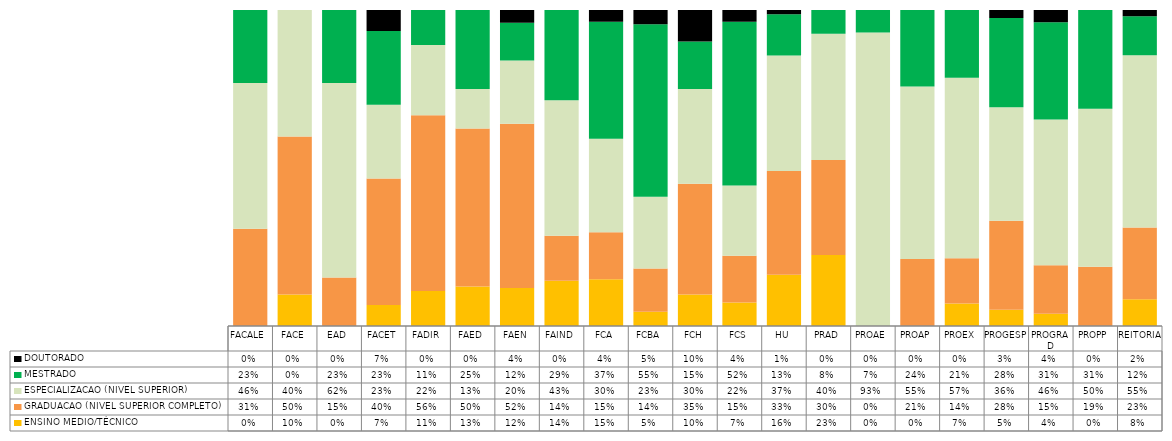
| Category | ENSINO MEDIO/TÉCNICO | GRADUACAO (NIVEL SUPERIOR COMPLETO) | ESPECIALIZACAO (NIVEL SUPERIOR)   | MESTRADO | DOUTORADO                             |
|---|---|---|---|---|---|
| FACALE | 0 | 0.308 | 0.462 | 0.231 | 0 |
| FACE | 0.1 | 0.5 | 0.4 | 0 | 0 |
| EAD | 0 | 0.154 | 0.615 | 0.231 | 0 |
| FACET | 0.067 | 0.4 | 0.233 | 0.233 | 0.067 |
| FADIR | 0.111 | 0.556 | 0.222 | 0.111 | 0 |
| FAED | 0.125 | 0.5 | 0.125 | 0.25 | 0 |
| FAEN | 0.12 | 0.52 | 0.2 | 0.12 | 0.04 |
| FAIND | 0.143 | 0.143 | 0.429 | 0.286 | 0 |
| FCA | 0.148 | 0.148 | 0.296 | 0.37 | 0.037 |
| FCBA | 0.045 | 0.136 | 0.227 | 0.545 | 0.045 |
| FCH | 0.1 | 0.35 | 0.3 | 0.15 | 0.1 |
| FCS | 0.074 | 0.148 | 0.222 | 0.519 | 0.037 |
| HU | 0.162 | 0.329 | 0.366 | 0.131 | 0.013 |
| PRAD | 0.225 | 0.3 | 0.4 | 0.075 | 0 |
| PROAE | 0 | 0 | 0.929 | 0.071 | 0 |
| PROAP | 0 | 0.212 | 0.545 | 0.242 | 0 |
| PROEX | 0.071 | 0.143 | 0.571 | 0.214 | 0 |
| PROGESP | 0.051 | 0.282 | 0.359 | 0.282 | 0.026 |
| PROGRAD | 0.038 | 0.154 | 0.462 | 0.308 | 0.038 |
| PROPP | 0 | 0.188 | 0.5 | 0.312 | 0 |
| REITORIA | 0.084 | 0.227 | 0.545 | 0.123 | 0.019 |